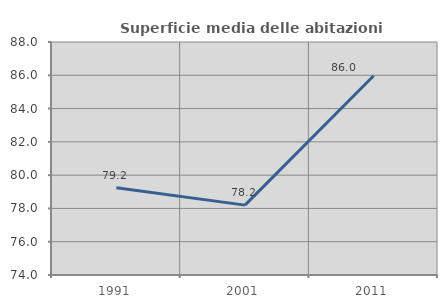
| Category | Superficie media delle abitazioni occupate |
|---|---|
| 1991.0 | 79.239 |
| 2001.0 | 78.198 |
| 2011.0 | 85.968 |